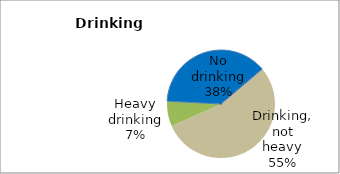
| Category | Series 0 |
|---|---|
| No drinking | 37.983 |
| Drinking, not heavy | 54.537 |
| Heavy drinking | 7.48 |